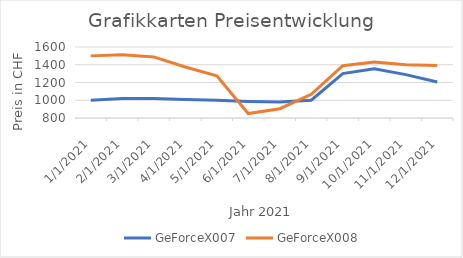
| Category | GeForceX007 | GeForceX008 |
|---|---|---|
| 1/1/21 | 1001 | 1500 |
| 2/1/21 | 1020 | 1513 |
| 3/1/21 | 1019 | 1488 |
| 4/1/21 | 1009 | 1375 |
| 5/1/21 | 1000 | 1276 |
| 6/1/21 | 987 | 850 |
| 7/1/21 | 979 | 905 |
| 8/1/21 | 1000 | 1067 |
| 9/1/21 | 1300 | 1389 |
| 10/1/21 | 1356 | 1432 |
| 11/1/21 | 1289 | 1399 |
| 12/1/21 | 1206 | 1391 |